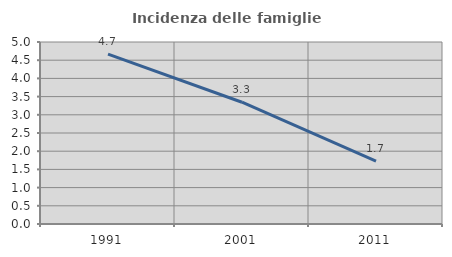
| Category | Incidenza delle famiglie numerose |
|---|---|
| 1991.0 | 4.668 |
| 2001.0 | 3.345 |
| 2011.0 | 1.729 |